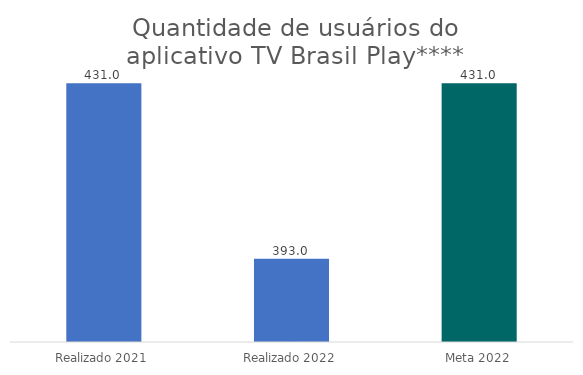
| Category | Series 0 |
|---|---|
| Realizado 2021 | 431 |
| Realizado 2022 | 393 |
| Meta 2022 | 431 |